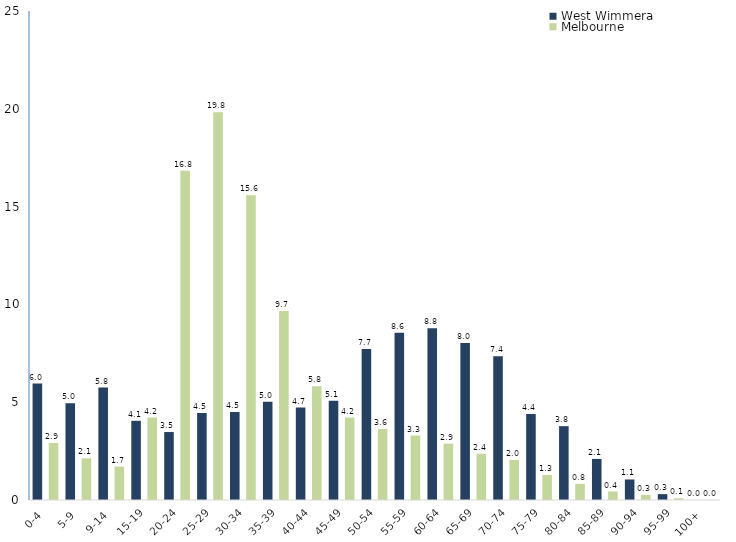
| Category | West Wimmera | Melbourne |
|---|---|---|
| 0-4 | 5.95 | 2.91 |
| 5-9 | 4.95 | 2.131 |
| 9-14 | 5.75 | 1.707 |
| 15-19 | 4.05 | 4.218 |
| 20-24 | 3.475 | 16.83 |
| 25-29 | 4.45 | 19.822 |
| 30-34 | 4.5 | 15.576 |
| 35-39 | 5.025 | 9.666 |
| 40-44 | 4.725 | 5.819 |
| 45-49 | 5.075 | 4.215 |
| 50-54 | 7.725 | 3.631 |
| 55-59 | 8.55 | 3.295 |
| 60-64 | 8.775 | 2.88 |
| 65-69 | 8.025 | 2.363 |
| 70-74 | 7.35 | 2.045 |
| 75-79 | 4.4 | 1.277 |
| 80-84 | 3.775 | 0.823 |
| 85-89 | 2.1 | 0.434 |
| 90-94 | 1.05 | 0.26 |
| 95-99 | 0.3 | 0.087 |
| 100+ | 0 | 0.009 |